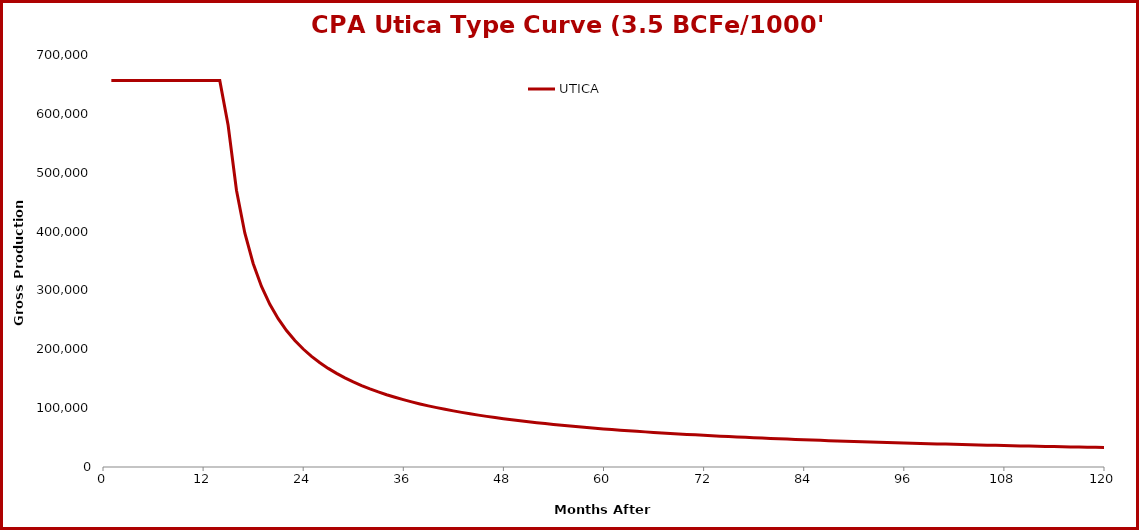
| Category | UTICA |
|---|---|
| 1.0 | 656483 |
| 2.0 | 656483 |
| 3.0 | 656483 |
| 4.0 | 656483 |
| 5.0 | 656483 |
| 6.0 | 656483 |
| 7.0 | 656483 |
| 8.0 | 656483 |
| 9.0 | 656483 |
| 10.0 | 656483 |
| 11.0 | 656483 |
| 12.0 | 656483 |
| 13.0 | 656483 |
| 14.0 | 656483 |
| 15.0 | 580622 |
| 16.0 | 470227 |
| 17.0 | 397556 |
| 18.0 | 345777 |
| 19.0 | 306851 |
| 20.0 | 276431 |
| 21.0 | 251946 |
| 22.0 | 231778 |
| 23.0 | 214853 |
| 24.0 | 200430 |
| 25.0 | 187978 |
| 26.0 | 177112 |
| 27.0 | 167538 |
| 28.0 | 159034 |
| 29.0 | 151425 |
| 30.0 | 144574 |
| 31.0 | 138369 |
| 32.0 | 132722 |
| 33.0 | 127559 |
| 34.0 | 122818 |
| 35.0 | 118448 |
| 36.0 | 114406 |
| 37.0 | 110655 |
| 38.0 | 107165 |
| 39.0 | 103908 |
| 40.0 | 100862 |
| 41.0 | 98005 |
| 42.0 | 95321 |
| 43.0 | 92793 |
| 44.0 | 90408 |
| 45.0 | 88153 |
| 46.0 | 86019 |
| 47.0 | 83996 |
| 48.0 | 82074 |
| 49.0 | 80246 |
| 50.0 | 78506 |
| 51.0 | 76847 |
| 52.0 | 75262 |
| 53.0 | 73748 |
| 54.0 | 72300 |
| 55.0 | 70912 |
| 56.0 | 69582 |
| 57.0 | 68305 |
| 58.0 | 67079 |
| 59.0 | 65901 |
| 60.0 | 64767 |
| 61.0 | 63675 |
| 62.0 | 62622 |
| 63.0 | 61607 |
| 64.0 | 60628 |
| 65.0 | 59682 |
| 66.0 | 58769 |
| 67.0 | 57885 |
| 68.0 | 57030 |
| 69.0 | 56203 |
| 70.0 | 55401 |
| 71.0 | 54624 |
| 72.0 | 53871 |
| 73.0 | 53140 |
| 74.0 | 52430 |
| 75.0 | 51742 |
| 76.0 | 51072 |
| 77.0 | 50422 |
| 78.0 | 49789 |
| 79.0 | 49174 |
| 80.0 | 48575 |
| 81.0 | 47992 |
| 82.0 | 47424 |
| 83.0 | 46871 |
| 84.0 | 46331 |
| 85.0 | 45806 |
| 86.0 | 45293 |
| 87.0 | 44792 |
| 88.0 | 44304 |
| 89.0 | 43827 |
| 90.0 | 43361 |
| 91.0 | 42906 |
| 92.0 | 42462 |
| 93.0 | 42027 |
| 94.0 | 41602 |
| 95.0 | 41187 |
| 96.0 | 40780 |
| 97.0 | 40382 |
| 98.0 | 39993 |
| 99.0 | 39612 |
| 100.0 | 39239 |
| 101.0 | 38873 |
| 102.0 | 38515 |
| 103.0 | 38164 |
| 104.0 | 37820 |
| 105.0 | 37482 |
| 106.0 | 37151 |
| 107.0 | 36827 |
| 108.0 | 36509 |
| 109.0 | 36196 |
| 110.0 | 35890 |
| 111.0 | 35589 |
| 112.0 | 35294 |
| 113.0 | 35004 |
| 114.0 | 34719 |
| 115.0 | 34439 |
| 116.0 | 34165 |
| 117.0 | 33894 |
| 118.0 | 33629 |
| 119.0 | 33368 |
| 120.0 | 33112 |
| 121.0 | 32860 |
| 122.0 | 32612 |
| 123.0 | 32368 |
| 124.0 | 32128 |
| 125.0 | 31892 |
| 126.0 | 31660 |
| 127.0 | 31431 |
| 128.0 | 31206 |
| 129.0 | 30985 |
| 130.0 | 30766 |
| 131.0 | 30552 |
| 132.0 | 30340 |
| 133.0 | 30132 |
| 134.0 | 29927 |
| 135.0 | 29725 |
| 136.0 | 29526 |
| 137.0 | 29330 |
| 138.0 | 29136 |
| 139.0 | 28946 |
| 140.0 | 28758 |
| 141.0 | 28573 |
| 142.0 | 28390 |
| 143.0 | 28210 |
| 144.0 | 28033 |
| 145.0 | 27858 |
| 146.0 | 27685 |
| 147.0 | 27515 |
| 148.0 | 27347 |
| 149.0 | 27181 |
| 150.0 | 27017 |
| 151.0 | 26856 |
| 152.0 | 26696 |
| 153.0 | 26539 |
| 154.0 | 26384 |
| 155.0 | 26230 |
| 156.0 | 26079 |
| 157.0 | 25930 |
| 158.0 | 25782 |
| 159.0 | 25636 |
| 160.0 | 25492 |
| 161.0 | 25350 |
| 162.0 | 25210 |
| 163.0 | 25071 |
| 164.0 | 24934 |
| 165.0 | 24799 |
| 166.0 | 24665 |
| 167.0 | 24533 |
| 168.0 | 24402 |
| 169.0 | 24273 |
| 170.0 | 24145 |
| 171.0 | 24019 |
| 172.0 | 23894 |
| 173.0 | 23771 |
| 174.0 | 23648 |
| 175.0 | 23527 |
| 176.0 | 23406 |
| 177.0 | 23285 |
| 178.0 | 23166 |
| 179.0 | 23047 |
| 180.0 | 22928 |
| 181.0 | 22810 |
| 182.0 | 22693 |
| 183.0 | 22576 |
| 184.0 | 22460 |
| 185.0 | 22344 |
| 186.0 | 22230 |
| 187.0 | 22115 |
| 188.0 | 22001 |
| 189.0 | 21888 |
| 190.0 | 21776 |
| 191.0 | 21664 |
| 192.0 | 21552 |
| 193.0 | 21441 |
| 194.0 | 21331 |
| 195.0 | 21222 |
| 196.0 | 21112 |
| 197.0 | 21004 |
| 198.0 | 20896 |
| 199.0 | 20788 |
| 200.0 | 20681 |
| 201.0 | 20575 |
| 202.0 | 20469 |
| 203.0 | 20364 |
| 204.0 | 20259 |
| 205.0 | 20155 |
| 206.0 | 20051 |
| 207.0 | 19948 |
| 208.0 | 19846 |
| 209.0 | 19744 |
| 210.0 | 19642 |
| 211.0 | 19541 |
| 212.0 | 19440 |
| 213.0 | 19341 |
| 214.0 | 19241 |
| 215.0 | 19142 |
| 216.0 | 19044 |
| 217.0 | 18946 |
| 218.0 | 18848 |
| 219.0 | 18751 |
| 220.0 | 18655 |
| 221.0 | 18559 |
| 222.0 | 18463 |
| 223.0 | 18369 |
| 224.0 | 18274 |
| 225.0 | 18180 |
| 226.0 | 18087 |
| 227.0 | 17994 |
| 228.0 | 17901 |
| 229.0 | 17809 |
| 230.0 | 17717 |
| 231.0 | 17626 |
| 232.0 | 17536 |
| 233.0 | 17445 |
| 234.0 | 17356 |
| 235.0 | 17266 |
| 236.0 | 17178 |
| 237.0 | 17089 |
| 238.0 | 17001 |
| 239.0 | 16914 |
| 240.0 | 16827 |
| 241.0 | 16740 |
| 242.0 | 16654 |
| 243.0 | 16569 |
| 244.0 | 16483 |
| 245.0 | 16399 |
| 246.0 | 16314 |
| 247.0 | 16230 |
| 248.0 | 16147 |
| 249.0 | 16064 |
| 250.0 | 15981 |
| 251.0 | 15899 |
| 252.0 | 15817 |
| 253.0 | 15736 |
| 254.0 | 15655 |
| 255.0 | 15575 |
| 256.0 | 15494 |
| 257.0 | 15415 |
| 258.0 | 15335 |
| 259.0 | 15257 |
| 260.0 | 15178 |
| 261.0 | 15100 |
| 262.0 | 15022 |
| 263.0 | 14945 |
| 264.0 | 14868 |
| 265.0 | 14792 |
| 266.0 | 14716 |
| 267.0 | 14640 |
| 268.0 | 14565 |
| 269.0 | 14490 |
| 270.0 | 14415 |
| 271.0 | 14341 |
| 272.0 | 14267 |
| 273.0 | 14194 |
| 274.0 | 14121 |
| 275.0 | 14048 |
| 276.0 | 13976 |
| 277.0 | 13904 |
| 278.0 | 13833 |
| 279.0 | 13762 |
| 280.0 | 13691 |
| 281.0 | 13620 |
| 282.0 | 13550 |
| 283.0 | 13481 |
| 284.0 | 13411 |
| 285.0 | 13342 |
| 286.0 | 13274 |
| 287.0 | 13206 |
| 288.0 | 13138 |
| 289.0 | 13070 |
| 290.0 | 13003 |
| 291.0 | 12936 |
| 292.0 | 12869 |
| 293.0 | 12803 |
| 294.0 | 12737 |
| 295.0 | 12672 |
| 296.0 | 12607 |
| 297.0 | 12542 |
| 298.0 | 12477 |
| 299.0 | 12413 |
| 300.0 | 12349 |
| 301.0 | 12286 |
| 302.0 | 12223 |
| 303.0 | 12160 |
| 304.0 | 12097 |
| 305.0 | 12035 |
| 306.0 | 11973 |
| 307.0 | 11912 |
| 308.0 | 11850 |
| 309.0 | 11789 |
| 310.0 | 11729 |
| 311.0 | 11668 |
| 312.0 | 11608 |
| 313.0 | 11549 |
| 314.0 | 11489 |
| 315.0 | 11430 |
| 316.0 | 11371 |
| 317.0 | 11313 |
| 318.0 | 11255 |
| 319.0 | 11197 |
| 320.0 | 11139 |
| 321.0 | 11082 |
| 322.0 | 11025 |
| 323.0 | 10968 |
| 324.0 | 10912 |
| 325.0 | 10856 |
| 326.0 | 10800 |
| 327.0 | 10744 |
| 328.0 | 10689 |
| 329.0 | 10634 |
| 330.0 | 10579 |
| 331.0 | 10525 |
| 332.0 | 10471 |
| 333.0 | 10417 |
| 334.0 | 10364 |
| 335.0 | 10310 |
| 336.0 | 10257 |
| 337.0 | 10204 |
| 338.0 | 10152 |
| 339.0 | 10100 |
| 340.0 | 10048 |
| 341.0 | 9996 |
| 342.0 | 9945 |
| 343.0 | 9894 |
| 344.0 | 9843 |
| 345.0 | 9792 |
| 346.0 | 9742 |
| 347.0 | 9692 |
| 348.0 | 9642 |
| 349.0 | 9592 |
| 350.0 | 9543 |
| 351.0 | 9494 |
| 352.0 | 9445 |
| 353.0 | 9396 |
| 354.0 | 9348 |
| 355.0 | 9300 |
| 356.0 | 9252 |
| 357.0 | 9205 |
| 358.0 | 9157 |
| 359.0 | 9110 |
| 360.0 | 9063 |
| 361.0 | 9017 |
| 362.0 | 8970 |
| 363.0 | 8924 |
| 364.0 | 8878 |
| 365.0 | 8833 |
| 366.0 | 8787 |
| 367.0 | 8742 |
| 368.0 | 8697 |
| 369.0 | 8652 |
| 370.0 | 8608 |
| 371.0 | 8563 |
| 372.0 | 8519 |
| 373.0 | 8476 |
| 374.0 | 8432 |
| 375.0 | 8389 |
| 376.0 | 8346 |
| 377.0 | 8303 |
| 378.0 | 8260 |
| 379.0 | 8217 |
| 380.0 | 8175 |
| 381.0 | 8133 |
| 382.0 | 8091 |
| 383.0 | 8050 |
| 384.0 | 8008 |
| 385.0 | 7967 |
| 386.0 | 7926 |
| 387.0 | 7885 |
| 388.0 | 7845 |
| 389.0 | 7804 |
| 390.0 | 7764 |
| 391.0 | 7724 |
| 392.0 | 7685 |
| 393.0 | 7645 |
| 394.0 | 7606 |
| 395.0 | 7567 |
| 396.0 | 7528 |
| 397.0 | 7489 |
| 398.0 | 7451 |
| 399.0 | 7412 |
| 400.0 | 7374 |
| 401.0 | 7336 |
| 402.0 | 7298 |
| 403.0 | 7261 |
| 404.0 | 7224 |
| 405.0 | 7186 |
| 406.0 | 7149 |
| 407.0 | 7113 |
| 408.0 | 7076 |
| 409.0 | 7040 |
| 410.0 | 7004 |
| 411.0 | 6968 |
| 412.0 | 6932 |
| 413.0 | 6896 |
| 414.0 | 6861 |
| 415.0 | 6825 |
| 416.0 | 6790 |
| 417.0 | 6755 |
| 418.0 | 6721 |
| 419.0 | 6686 |
| 420.0 | 6652 |
| 421.0 | 6617 |
| 422.0 | 6583 |
| 423.0 | 6549 |
| 424.0 | 6516 |
| 425.0 | 6482 |
| 426.0 | 6449 |
| 427.0 | 6416 |
| 428.0 | 6383 |
| 429.0 | 6350 |
| 430.0 | 6317 |
| 431.0 | 6285 |
| 432.0 | 6252 |
| 433.0 | 6220 |
| 434.0 | 6188 |
| 435.0 | 6156 |
| 436.0 | 6125 |
| 437.0 | 6093 |
| 438.0 | 6062 |
| 439.0 | 6031 |
| 440.0 | 6000 |
| 441.0 | 5969 |
| 442.0 | 5938 |
| 443.0 | 5908 |
| 444.0 | 5877 |
| 445.0 | 5847 |
| 446.0 | 5817 |
| 447.0 | 5787 |
| 448.0 | 5757 |
| 449.0 | 5728 |
| 450.0 | 5698 |
| 451.0 | 5669 |
| 452.0 | 5640 |
| 453.0 | 5611 |
| 454.0 | 5582 |
| 455.0 | 5553 |
| 456.0 | 5525 |
| 457.0 | 5496 |
| 458.0 | 5468 |
| 459.0 | 5440 |
| 460.0 | 5412 |
| 461.0 | 5384 |
| 462.0 | 5356 |
| 463.0 | 5329 |
| 464.0 | 5301 |
| 465.0 | 5274 |
| 466.0 | 5247 |
| 467.0 | 5220 |
| 468.0 | 5193 |
| 469.0 | 5166 |
| 470.0 | 5140 |
| 471.0 | 5113 |
| 472.0 | 5087 |
| 473.0 | 5061 |
| 474.0 | 5035 |
| 475.0 | 5009 |
| 476.0 | 4983 |
| 477.0 | 4958 |
| 478.0 | 4932 |
| 479.0 | 4907 |
| 480.0 | 4882 |
| 481.0 | 4857 |
| 482.0 | 4832 |
| 483.0 | 4807 |
| 484.0 | 4782 |
| 485.0 | 4757 |
| 486.0 | 4733 |
| 487.0 | 4709 |
| 488.0 | 4684 |
| 489.0 | 4660 |
| 490.0 | 4636 |
| 491.0 | 4612 |
| 492.0 | 4589 |
| 493.0 | 4565 |
| 494.0 | 4542 |
| 495.0 | 4518 |
| 496.0 | 4495 |
| 497.0 | 4472 |
| 498.0 | 4449 |
| 499.0 | 4426 |
| 500.0 | 4403 |
| 501.0 | 4381 |
| 502.0 | 4358 |
| 503.0 | 4336 |
| 504.0 | 4313 |
| 505.0 | 4291 |
| 506.0 | 4269 |
| 507.0 | 4247 |
| 508.0 | 4225 |
| 509.0 | 4204 |
| 510.0 | 4182 |
| 511.0 | 4160 |
| 512.0 | 4139 |
| 513.0 | 4118 |
| 514.0 | 4097 |
| 515.0 | 4076 |
| 516.0 | 4055 |
| 517.0 | 4034 |
| 518.0 | 4013 |
| 519.0 | 3992 |
| 520.0 | 3972 |
| 521.0 | 3951 |
| 522.0 | 3931 |
| 523.0 | 3911 |
| 524.0 | 3891 |
| 525.0 | 3871 |
| 526.0 | 3851 |
| 527.0 | 3831 |
| 528.0 | 3811 |
| 529.0 | 3792 |
| 530.0 | 3772 |
| 531.0 | 3753 |
| 532.0 | 3734 |
| 533.0 | 3714 |
| 534.0 | 3695 |
| 535.0 | 3676 |
| 536.0 | 3657 |
| 537.0 | 3638 |
| 538.0 | 3620 |
| 539.0 | 3601 |
| 540.0 | 3583 |
| 541.0 | 3564 |
| 542.0 | 3546 |
| 543.0 | 3528 |
| 544.0 | 3509 |
| 545.0 | 3491 |
| 546.0 | 3473 |
| 547.0 | 3456 |
| 548.0 | 3438 |
| 549.0 | 3420 |
| 550.0 | 3403 |
| 551.0 | 3385 |
| 552.0 | 3368 |
| 553.0 | 3350 |
| 554.0 | 3333 |
| 555.0 | 3316 |
| 556.0 | 3299 |
| 557.0 | 3282 |
| 558.0 | 3265 |
| 559.0 | 3248 |
| 560.0 | 3232 |
| 561.0 | 3215 |
| 562.0 | 3198 |
| 563.0 | 3182 |
| 564.0 | 3166 |
| 565.0 | 3149 |
| 566.0 | 3133 |
| 567.0 | 3117 |
| 568.0 | 3101 |
| 569.0 | 3085 |
| 570.0 | 3069 |
| 571.0 | 3053 |
| 572.0 | 3038 |
| 573.0 | 3022 |
| 574.0 | 3007 |
| 575.0 | 2991 |
| 576.0 | 2976 |
| 577.0 | 2960 |
| 578.0 | 2945 |
| 579.0 | 2930 |
| 580.0 | 2915 |
| 581.0 | 2900 |
| 582.0 | 2885 |
| 583.0 | 2870 |
| 584.0 | 2855 |
| 585.0 | 2841 |
| 586.0 | 2826 |
| 587.0 | 2812 |
| 588.0 | 2797 |
| 589.0 | 2783 |
| 590.0 | 2768 |
| 591.0 | 2754 |
| 592.0 | 2740 |
| 593.0 | 2726 |
| 594.0 | 2712 |
| 595.0 | 2698 |
| 596.0 | 2684 |
| 597.0 | 2670 |
| 598.0 | 2657 |
| 599.0 | 2643 |
| 600.0 | 2629 |
| 601.0 | 2616 |
| 602.0 | 2602 |
| 603.0 | 2589 |
| 604.0 | 2576 |
| 605.0 | 2562 |
| 606.0 | 2549 |
| 607.0 | 2536 |
| 608.0 | 2523 |
| 609.0 | 2510 |
| 610.0 | 2497 |
| 611.0 | 2484 |
| 612.0 | 2472 |
| 613.0 | 2459 |
| 614.0 | 2446 |
| 615.0 | 2434 |
| 616.0 | 2421 |
| 617.0 | 2409 |
| 618.0 | 2396 |
| 619.0 | 2384 |
| 620.0 | 2372 |
| 621.0 | 2359 |
| 622.0 | 2347 |
| 623.0 | 2335 |
| 624.0 | 2323 |
| 625.0 | 2311 |
| 626.0 | 2299 |
| 627.0 | 2288 |
| 628.0 | 2276 |
| 629.0 | 2264 |
| 630.0 | 2252 |
| 631.0 | 2241 |
| 632.0 | 2229 |
| 633.0 | 2218 |
| 634.0 | 2207 |
| 635.0 | 2195 |
| 636.0 | 2184 |
| 637.0 | 2173 |
| 638.0 | 2161 |
| 639.0 | 2150 |
| 640.0 | 2139 |
| 641.0 | 2128 |
| 642.0 | 2117 |
| 643.0 | 2106 |
| 644.0 | 2096 |
| 645.0 | 2085 |
| 646.0 | 2074 |
| 647.0 | 2063 |
| 648.0 | 2053 |
| 649.0 | 2042 |
| 650.0 | 2032 |
| 651.0 | 2021 |
| 652.0 | 2011 |
| 653.0 | 2001 |
| 654.0 | 1990 |
| 655.0 | 1980 |
| 656.0 | 1970 |
| 657.0 | 1960 |
| 658.0 | 1950 |
| 659.0 | 1940 |
| 660.0 | 1930 |
| 661.0 | 1920 |
| 662.0 | 1910 |
| 663.0 | 1900 |
| 664.0 | 1890 |
| 665.0 | 1881 |
| 666.0 | 1871 |
| 667.0 | 1861 |
| 668.0 | 1852 |
| 669.0 | 1842 |
| 670.0 | 1833 |
| 671.0 | 1823 |
| 672.0 | 1814 |
| 673.0 | 1805 |
| 674.0 | 1795 |
| 675.0 | 1786 |
| 676.0 | 1777 |
| 677.0 | 1768 |
| 678.0 | 1759 |
| 679.0 | 1750 |
| 680.0 | 1741 |
| 681.0 | 1732 |
| 682.0 | 1723 |
| 683.0 | 1714 |
| 684.0 | 1705 |
| 685.0 | 1696 |
| 686.0 | 1688 |
| 687.0 | 1679 |
| 688.0 | 1670 |
| 689.0 | 1662 |
| 690.0 | 1653 |
| 691.0 | 1645 |
| 692.0 | 1636 |
| 693.0 | 1628 |
| 694.0 | 1619 |
| 695.0 | 1611 |
| 696.0 | 1603 |
| 697.0 | 1595 |
| 698.0 | 1586 |
| 699.0 | 1578 |
| 700.0 | 1570 |
| 701.0 | 1562 |
| 702.0 | 1554 |
| 703.0 | 1546 |
| 704.0 | 1538 |
| 705.0 | 1530 |
| 706.0 | 1522 |
| 707.0 | 1514 |
| 708.0 | 1507 |
| 709.0 | 1499 |
| 710.0 | 1491 |
| 711.0 | 1483 |
| 712.0 | 1476 |
| 713.0 | 1468 |
| 714.0 | 1461 |
| 715.0 | 1453 |
| 716.0 | 1446 |
| 717.0 | 1438 |
| 718.0 | 1431 |
| 719.0 | 1424 |
| 720.0 | 1416 |
| 721.0 | 1409 |
| 722.0 | 1402 |
| 723.0 | 1394 |
| 724.0 | 1387 |
| 725.0 | 1380 |
| 726.0 | 1373 |
| 727.0 | 1366 |
| 728.0 | 1359 |
| 729.0 | 1352 |
| 730.0 | 1345 |
| 731.0 | 1338 |
| 732.0 | 1331 |
| 733.0 | 1324 |
| 734.0 | 1318 |
| 735.0 | 1311 |
| 736.0 | 1304 |
| 737.0 | 1297 |
| 738.0 | 1291 |
| 739.0 | 1284 |
| 740.0 | 1277 |
| 741.0 | 1271 |
| 742.0 | 1264 |
| 743.0 | 1258 |
| 744.0 | 1251 |
| 745.0 | 1245 |
| 746.0 | 1239 |
| 747.0 | 1232 |
| 748.0 | 1226 |
| 749.0 | 1219 |
| 750.0 | 1213 |
| 751.0 | 1207 |
| 752.0 | 1201 |
| 753.0 | 1195 |
| 754.0 | 1188 |
| 755.0 | 1182 |
| 756.0 | 1176 |
| 757.0 | 1170 |
| 758.0 | 1164 |
| 759.0 | 1158 |
| 760.0 | 1152 |
| 761.0 | 1146 |
| 762.0 | 1140 |
| 763.0 | 1135 |
| 764.0 | 1129 |
| 765.0 | 1123 |
| 766.0 | 1117 |
| 767.0 | 1111 |
| 768.0 | 1106 |
| 769.0 | 1100 |
| 770.0 | 1094 |
| 771.0 | 1089 |
| 772.0 | 1083 |
| 773.0 | 1078 |
| 774.0 | 1072 |
| 775.0 | 1066 |
| 776.0 | 1061 |
| 777.0 | 1056 |
| 778.0 | 1050 |
| 779.0 | 1045 |
| 780.0 | 1039 |